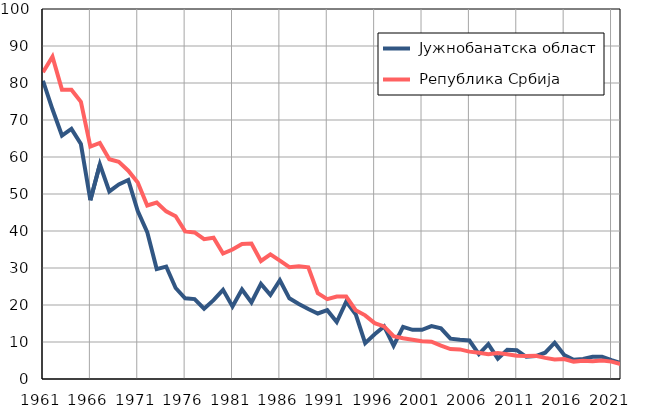
| Category |  Јужнобанатска област |  Република Србија |
|---|---|---|
| 1961.0 | 80.6 | 82.9 |
| 1962.0 | 72.9 | 87.1 |
| 1963.0 | 65.8 | 78.2 |
| 1964.0 | 67.6 | 78.2 |
| 1965.0 | 63.5 | 74.9 |
| 1966.0 | 48.3 | 62.8 |
| 1967.0 | 58 | 63.8 |
| 1968.0 | 50.7 | 59.4 |
| 1969.0 | 52.6 | 58.7 |
| 1970.0 | 53.8 | 56.3 |
| 1971.0 | 45.4 | 53.1 |
| 1972.0 | 39.7 | 46.9 |
| 1973.0 | 29.7 | 47.7 |
| 1974.0 | 30.4 | 45.3 |
| 1975.0 | 24.6 | 44 |
| 1976.0 | 21.8 | 39.9 |
| 1977.0 | 21.6 | 39.6 |
| 1978.0 | 19 | 37.8 |
| 1979.0 | 21.3 | 38.2 |
| 1980.0 | 24.1 | 33.9 |
| 1981.0 | 19.6 | 35 |
| 1982.0 | 24.2 | 36.5 |
| 1983.0 | 20.7 | 36.6 |
| 1984.0 | 25.7 | 31.9 |
| 1985.0 | 22.7 | 33.7 |
| 1986.0 | 26.7 | 32 |
| 1987.0 | 21.8 | 30.2 |
| 1988.0 | 20.3 | 30.5 |
| 1989.0 | 18.9 | 30.2 |
| 1990.0 | 17.7 | 23.2 |
| 1991.0 | 18.6 | 21.6 |
| 1992.0 | 15.4 | 22.3 |
| 1993.0 | 20.9 | 22.3 |
| 1994.0 | 17.5 | 18.6 |
| 1995.0 | 9.7 | 17.2 |
| 1996.0 | 12.1 | 15.1 |
| 1997.0 | 14.2 | 14.2 |
| 1998.0 | 9 | 11.6 |
| 1999.0 | 14.1 | 11 |
| 2000.0 | 13.3 | 10.6 |
| 2001.0 | 13.3 | 10.2 |
| 2002.0 | 14.3 | 10.1 |
| 2003.0 | 13.7 | 9 |
| 2004.0 | 10.9 | 8.1 |
| 2005.0 | 10.6 | 8 |
| 2006.0 | 10.4 | 7.4 |
| 2007.0 | 6.7 | 7.1 |
| 2008.0 | 9.4 | 6.7 |
| 2009.0 | 5.5 | 7 |
| 2010.0 | 7.9 | 6.7 |
| 2011.0 | 7.8 | 6.3 |
| 2012.0 | 6 | 6.2 |
| 2013.0 | 6.2 | 6.3 |
| 2014.0 | 7.1 | 5.7 |
| 2015.0 | 9.8 | 5.3 |
| 2016.0 | 6.5 | 5.4 |
| 2017.0 | 5.2 | 4.7 |
| 2018.0 | 5.4 | 4.9 |
| 2019.0 | 6 | 4.8 |
| 2020.0 | 6 | 5 |
| 2021.0 | 5.1 | 4.7 |
| 2022.0 | 4.3 | 4 |